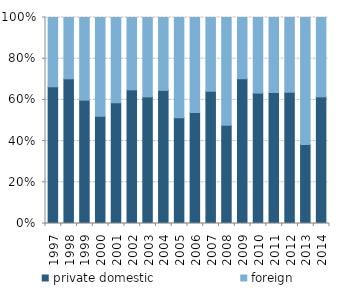
| Category | private domestic | foreign |
|---|---|---|
| 1997.0 | 288000000 | 146000000 |
| 1998.0 | 198000000 | 83900000 |
| 1999.0 | 294000000 | 197000000 |
| 2000.0 | 269000000 | 248000000 |
| 2001.0 | 259000000 | 183000000 |
| 2002.0 | 253000000 | 137000000 |
| 2003.0 | 252000000 | 158000000 |
| 2004.0 | 446000000 | 244000000 |
| 2005.0 | 281000000 | 267000000 |
| 2006.0 | 305000000 | 261000000 |
| 2007.0 | 583000000 | 325000000 |
| 2008.0 | 276000000 | 302000000 |
| 2009.0 | 305000000 | 129000000 |
| 2010.0 | 183000000 | 106000000 |
| 2011.0 | 199000000 | 114000000 |
| 2012.0 | 181000000 | 103000000 |
| 2013.0 | 136000000 | 219000000 |
| 2014.0 | 124000000 | 77700000 |